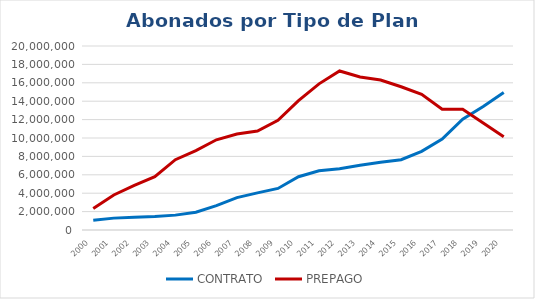
| Category | CONTRATO | PREPAGO |
|---|---|---|
| 2000.0 | 1068130 | 2333395 |
| 2001.0 | 1290852 | 3809931 |
| 2002.0 | 1382871 | 4861439 |
| 2003.0 | 1473310 | 5794971 |
| 2004.0 | 1616653 | 7644732 |
| 2005.0 | 1931459 | 8638113 |
| 2006.0 | 2644224 | 9806577 |
| 2007.0 | 3523166 | 10432036 |
| 2008.0 | 4033678 | 10762915 |
| 2009.0 | 4517200 | 11933023 |
| 2010.0 | 5786405 | 14065837 |
| 2011.0 | 6429681 | 15885567 |
| 2012.0 | 6657716 | 17283257 |
| 2013.0 | 7031350 | 16629989 |
| 2014.0 | 7375577 | 16305141 |
| 2015.0 | 7638385 | 15567968 |
| 2016.0 | 8556131 | 14746472 |
| 2017.0 | 9878035 | 13135112 |
| 2018.0 | 12051532 | 13127449 |
| 2019.0 | 13431953 | 11619715 |
| 2020.0 | 14943390 | 10124859 |